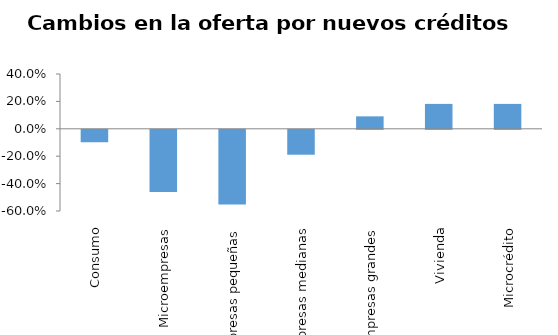
| Category | Series 0 |
|---|---|
| Consumo | -0.091 |
| Microempresas | -0.455 |
| Empresas pequeñas | -0.545 |
| Empresas medianas | -0.182 |
| Empresas grandes | 0.091 |
| Vivienda | 0.182 |
| Microcrédito | 0.182 |